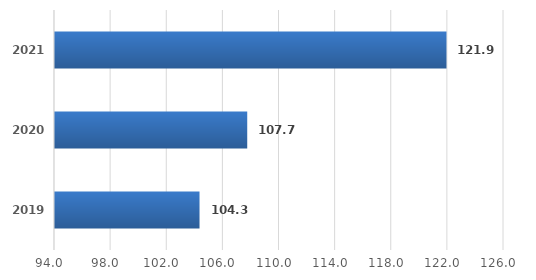
| Category | Series 0 |
|---|---|
| 2019.0 | 104.3 |
| 2020.0 | 107.7 |
| 2021.0 | 121.9 |